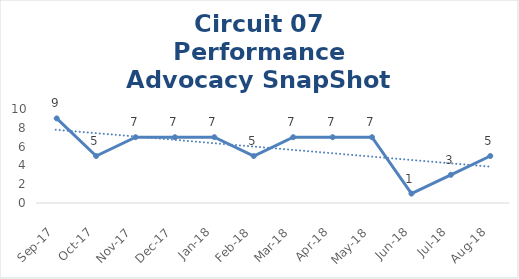
| Category | Circuit 07 |
|---|---|
| Sep-17 | 9 |
| Oct-17 | 5 |
| Nov-17 | 7 |
| Dec-17 | 7 |
| Jan-18 | 7 |
| Feb-18 | 5 |
| Mar-18 | 7 |
| Apr-18 | 7 |
| May-18 | 7 |
| Jun-18 | 1 |
| Jul-18 | 3 |
| Aug-18 | 5 |